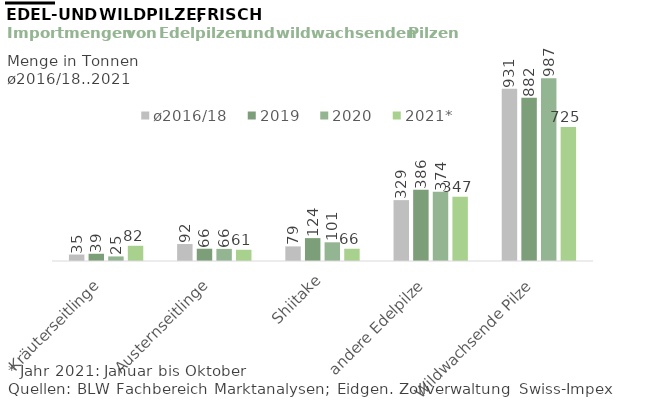
| Category | ø2016/18 | 2019 | 2020 | 2021* |
|---|---|---|---|---|
| Kräuterseitlinge | 34.888 | 39.131 | 24.71 | 82.24 |
| Austernseitlinge | 91.698 | 66.388 | 65.534 | 60.713 |
| Shiitake | 78.946 | 123.637 | 101.028 | 66.157 |
| andere Edelpilze | 329.026 | 385.705 | 373.844 | 347.417 |
| Wildwachsende Pilze | 931.092 | 881.945 | 987.455 | 724.644 |